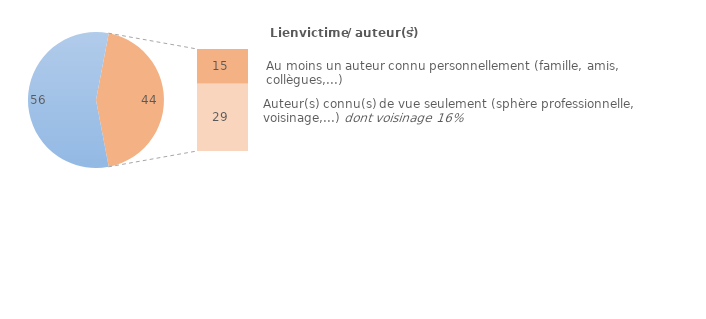
| Category | 56 |
|---|---|
| 0 | 56 |
| 1 | 0 |
| 2 | 15 |
| 3 | 29 |